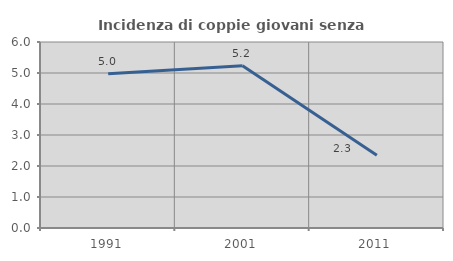
| Category | Incidenza di coppie giovani senza figli |
|---|---|
| 1991.0 | 4.976 |
| 2001.0 | 5.237 |
| 2011.0 | 2.344 |